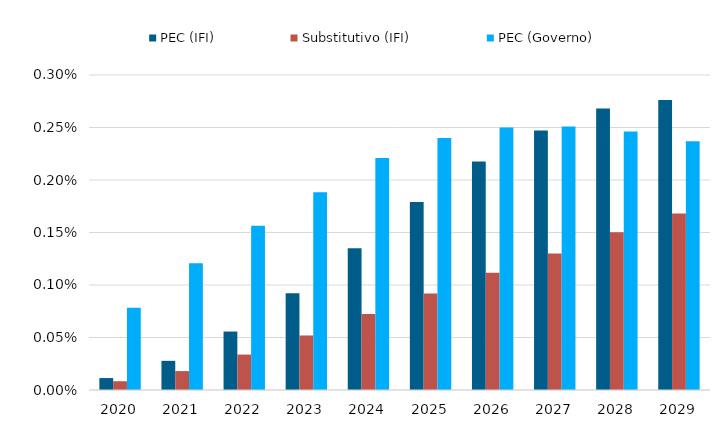
| Category | PEC (IFI) | Substitutivo (IFI) | PEC (Governo) |
|---|---|---|---|
| 2020.0 | 0 | 0 | 0.001 |
| 2021.0 | 0 | 0 | 0.001 |
| 2022.0 | 0.001 | 0 | 0.002 |
| 2023.0 | 0.001 | 0.001 | 0.002 |
| 2024.0 | 0.001 | 0.001 | 0.002 |
| 2025.0 | 0.002 | 0.001 | 0.002 |
| 2026.0 | 0.002 | 0.001 | 0.002 |
| 2027.0 | 0.002 | 0.001 | 0.003 |
| 2028.0 | 0.003 | 0.002 | 0.002 |
| 2029.0 | 0.003 | 0.002 | 0.002 |